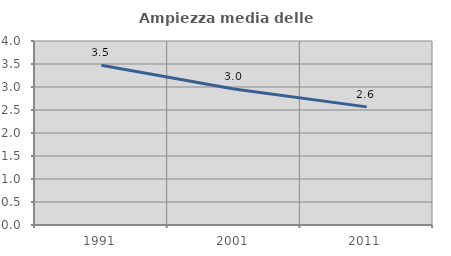
| Category | Ampiezza media delle famiglie |
|---|---|
| 1991.0 | 3.471 |
| 2001.0 | 2.956 |
| 2011.0 | 2.568 |